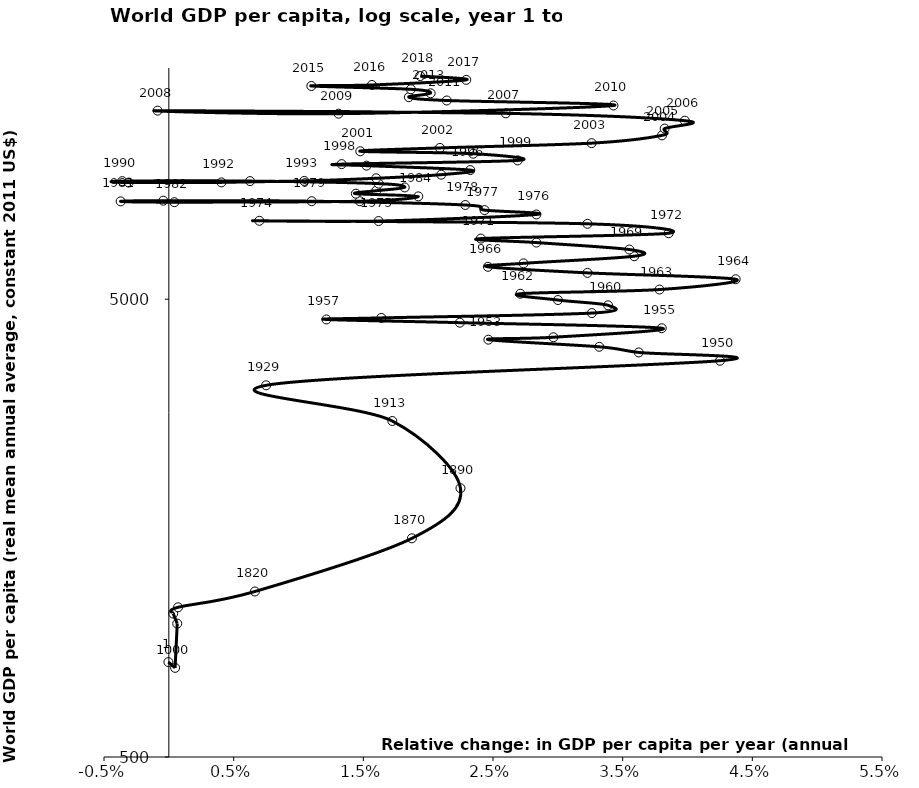
| Category | Series 0 |
|---|---|
| -3.2964904247325514e-05 | 805.966 |
| 0.00048414247452653744 | 782.914 |
| 0.0006483072727696871 | 978.015 |
| 0.0003366896219166723 | 1028.772 |
| 0.000711691670645235 | 1061.7 |
| 0.006639152149222473 | 1149.561 |
| 0.01874629475675129 | 1502 |
| 0.0224917501302611 | 1933 |
| 0.017233574754267976 | 2710 |
| 0.007503075030750307 | 3243 |
| 0.04250681198910082 | 3670 |
| 0.036239782016348775 | 3826 |
| 0.03319393622582331 | 3936 |
| 0.02464430894308943 | 4080 |
| 0.029656862745098038 | 4130 |
| 0.03801452784503632 | 4322 |
| 0.02244331328088848 | 4444 |
| 0.012151215121512151 | 4516 |
| 0.016386182462356066 | 4552 |
| 0.032623022847100176 | 4664 |
| 0.033876500857632934 | 4849 |
| 0.03000618684264797 | 4980 |
| 0.02710843373493976 | 5140 |
| 0.037840466926070036 | 5250 |
| 0.04371428571428571 | 5529 |
| 0.032284319045035266 | 5709 |
| 0.024610264494657558 | 5886 |
| 0.027353041114509005 | 5990 |
| 0.03589315525876461 | 6208 |
| 0.03551868556701031 | 6420 |
| 0.028348909657320873 | 6649 |
| 0.024063768987817716 | 6784 |
| 0.03854658018867924 | 6969 |
| 0.032285837279380114 | 7307 |
| 0.006979608594498426 | 7419 |
| 0.016174686615446826 | 7409 |
| 0.028343906060197058 | 7659 |
| 0.024350437393915656 | 7829 |
| 0.022863711840592667 | 8032 |
| 0.011018426294820718 | 8187 |
| -0.00042750702332966896 | 8209 |
| -0.0037154342794493847 | 8180 |
| 0.0004278728606356968 | 8148 |
| 0.014727540500736377 | 8187 |
| 0.019237816049835106 | 8388 |
| 0.014425369575584168 | 8502 |
| 0.015996236179722418 | 8630 |
| 0.018192352259559674 | 8774 |
| 0.01618418053339412 | 8944 |
| 0.006261180679785331 | 9058 |
| -0.003587988518436741 | 9056 |
| -0.0030918727915194345 | 8993 |
| 0.004058712331813633 | 9000 |
| 0.010444444444444444 | 9066 |
| 0.01599382307522612 | 9188 |
| 0.021005659555942535 | 9356 |
| 0.02324711415134673 | 9574 |
| 0.015249634426571965 | 9791 |
| 0.01332856705137371 | 9866 |
| 0.026910602067707276 | 10052 |
| 0.02347791484281735 | 10397 |
| 0.014763874194479177 | 10524 |
| 0.02090459901178259 | 10704 |
| 0.03260463378176383 | 10964 |
| 0.03803356439255746 | 11402 |
| 0.038238905455183304 | 11798 |
| 0.039794880488218345 | 12274 |
| 0.02598989734397914 | 12737 |
| -0.0008636256575331711 | 12912 |
| 0.013088599752168525 | 12715 |
| 0.03429020841525757 | 13250 |
| 0.021433962264150945 | 13587 |
| 0.018510340766909546 | 13818 |
| 0.02019105514546244 | 14090 |
| 0.018665720369056067 | 14376 |
| 0.01099053978853645 | 14616 |
| 0.015661419237709633 | 14692 |
| 0.022937458261331256 | 15073.815 |
| 0.01938325991189442 | 15365.994 |